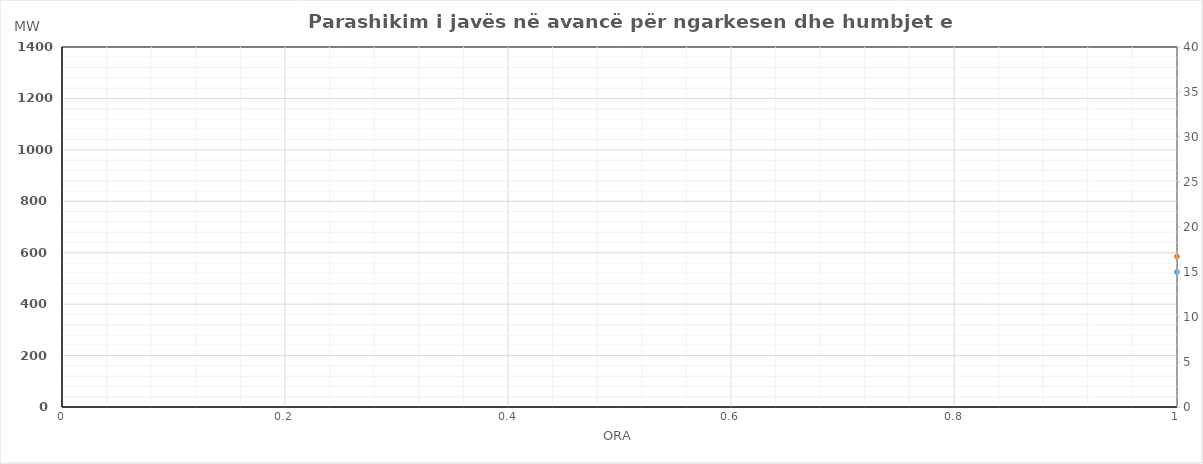
| Category | Ngarkesa (MWh) |
|---|---|
| 0 | 585.375 |
| 1 | 703.012 |
| 2 | 783.949 |
| 3 | 803.789 |
| 4 | 771.177 |
| 5 | 850.797 |
| 6 | 896.639 |
| 7 | 1071.505 |
| 8 | 1111.554 |
| 9 | 1080.308 |
| 10 | 1063.48 |
| 11 | 1050.434 |
| 12 | 1056.552 |
| 13 | 958.675 |
| 14 | 1069.815 |
| 15 | 1011.44 |
| 16 | 1062.888 |
| 17 | 1180.088 |
| 18 | 1264.037 |
| 19 | 1227.377 |
| 20 | 1172.062 |
| 21 | 1141.3 |
| 22 | 944.22 |
| 23 | 801.949 |
| 24 | 600.874 |
| 25 | 521.51 |
| 26 | 497.229 |
| 27 | 493.713 |
| 28 | 498.155 |
| 29 | 583.117 |
| 30 | 752.412 |
| 31 | 950.763 |
| 32 | 976.755 |
| 33 | 965.611 |
| 34 | 928.461 |
| 35 | 946.945 |
| 36 | 918.925 |
| 37 | 927.979 |
| 38 | 924.661 |
| 39 | 925.831 |
| 40 | 886.871 |
| 41 | 1007.006 |
| 42 | 1094.486 |
| 43 | 1093.845 |
| 44 | 1083.018 |
| 45 | 984.357 |
| 46 | 834.347 |
| 47 | 713.452 |
| 48 | 633.557 |
| 49 | 540.811 |
| 50 | 491.748 |
| 51 | 484.619 |
| 52 | 487.052 |
| 53 | 522.183 |
| 54 | 704.159 |
| 55 | 906.964 |
| 56 | 923.262 |
| 57 | 922.697 |
| 58 | 914.778 |
| 59 | 919.905 |
| 60 | 938.136 |
| 61 | 958.904 |
| 62 | 972.15 |
| 63 | 956.289 |
| 64 | 938.026 |
| 65 | 1040.346 |
| 66 | 1125.627 |
| 67 | 1104.119 |
| 68 | 1085.929 |
| 69 | 974.625 |
| 70 | 797.138 |
| 71 | 712.663 |
| 72 | 572.687 |
| 73 | 524.27 |
| 74 | 528.816 |
| 75 | 532.949 |
| 76 | 500.404 |
| 77 | 577.621 |
| 78 | 734.84 |
| 79 | 925.487 |
| 80 | 985.14 |
| 81 | 959.977 |
| 82 | 911.715 |
| 83 | 870.163 |
| 84 | 843.551 |
| 85 | 859.147 |
| 86 | 855.236 |
| 87 | 857.325 |
| 88 | 848.831 |
| 89 | 990.173 |
| 90 | 1089.809 |
| 91 | 1098.113 |
| 92 | 1073.145 |
| 93 | 963.606 |
| 94 | 855.639 |
| 95 | 690.749 |
| 96 | 576.648 |
| 97 | 517.393 |
| 98 | 482.977 |
| 99 | 480.755 |
| 100 | 475.371 |
| 101 | 507.309 |
| 102 | 716.754 |
| 103 | 930.511 |
| 104 | 958.772 |
| 105 | 931.517 |
| 106 | 878.377 |
| 107 | 865.062 |
| 108 | 836.752 |
| 109 | 868.533 |
| 110 | 879.208 |
| 111 | 868.633 |
| 112 | 878.299 |
| 113 | 979.064 |
| 114 | 1098.751 |
| 115 | 1102.092 |
| 116 | 1042.242 |
| 117 | 944.39 |
| 118 | 806.627 |
| 119 | 648.532 |
| 120 | 552.083 |
| 121 | 508.249 |
| 122 | 472.905 |
| 123 | 472.287 |
| 124 | 474.855 |
| 125 | 534.248 |
| 126 | 649.977 |
| 127 | 829.18 |
| 128 | 975.151 |
| 129 | 1009.585 |
| 130 | 1017.231 |
| 131 | 1045.309 |
| 132 | 1005.566 |
| 133 | 997.03 |
| 134 | 988.052 |
| 135 | 990.198 |
| 136 | 1008.835 |
| 137 | 1078.743 |
| 138 | 1130.911 |
| 139 | 1118.286 |
| 140 | 1085.715 |
| 141 | 967.196 |
| 142 | 836.91 |
| 143 | 750.625 |
| 144 | 663.312 |
| 145 | 552.89 |
| 146 | 506.561 |
| 147 | 493.069 |
| 148 | 495.39 |
| 149 | 531.868 |
| 150 | 618.258 |
| 151 | 738.79 |
| 152 | 877.595 |
| 153 | 924.646 |
| 154 | 934.184 |
| 155 | 898.675 |
| 156 | 876.629 |
| 157 | 956.407 |
| 158 | 948.758 |
| 159 | 942.054 |
| 160 | 965.535 |
| 161 | 1045.143 |
| 162 | 1151.736 |
| 163 | 1183.044 |
| 164 | 1154.473 |
| 165 | 1040.872 |
| 166 | 865.709 |
| 167 | 719.933 |